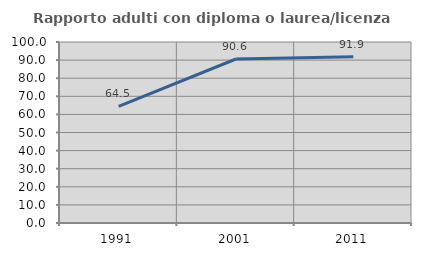
| Category | Rapporto adulti con diploma o laurea/licenza media  |
|---|---|
| 1991.0 | 64.481 |
| 2001.0 | 90.608 |
| 2011.0 | 91.905 |